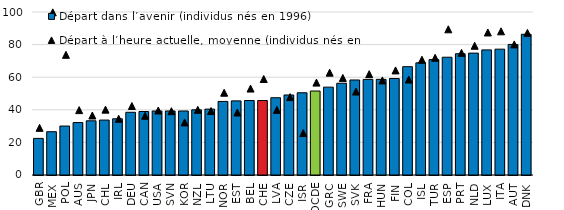
| Category | Départ dans l’avenir (individus nés en 1996) |
|---|---|
| GBR | 22.461 |
| MEX | 26.559 |
| POL | 30.034 |
| AUS | 32.161 |
| JPN | 33.262 |
| CHL | 33.697 |
| IRL | 34.499 |
| DEU | 38.474 |
| CAN | 38.949 |
| USA | 39.258 |
| SVN | 39.266 |
| KOR | 39.268 |
| NZL | 39.998 |
| LTU | 40.427 |
| NOR | 45.14 |
| EST | 45.473 |
| BEL | 45.688 |
| CHE | 45.698 |
| LVA | 47.396 |
| CZE | 49.098 |
| ISR | 50.455 |
| OCDE | 51.522 |
| GRC | 53.909 |
| SWE | 56.297 |
| SVK | 58.298 |
| FRA | 58.654 |
| HUN | 58.676 |
| FIN | 59.206 |
| COL | 66.453 |
| ISL | 68.793 |
| TUR | 70.8 |
| ESP | 72.258 |
| PRT | 74.391 |
| NLD | 74.771 |
| LUX | 76.746 |
| ITA | 77.203 |
| AUT | 80.1 |
| DNK | 86.331 |